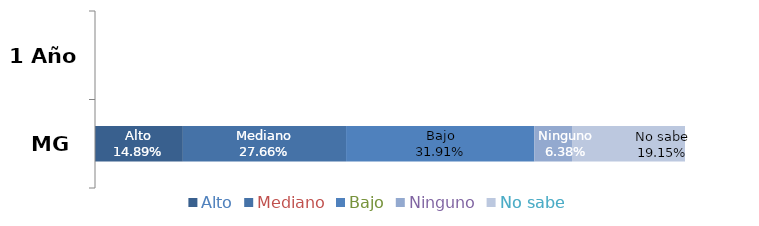
| Category | Alto | Mediano | Bajo | Ninguno | No sabe |
|---|---|---|---|---|---|
| MG | 0.149 | 0.277 | 0.319 | 0.064 | 0.191 |
| 1 Año | 0 | 0 | 0 | 0 | 0 |